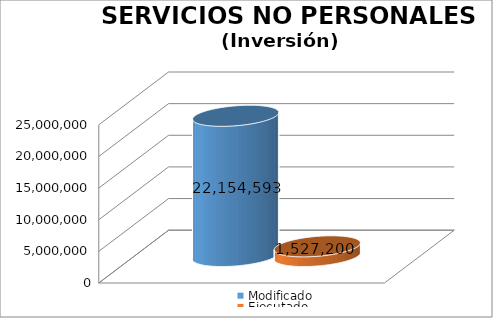
| Category | Modificado | Ejecutado |
|---|---|---|
| 0 | 22154593 | 1527199.87 |